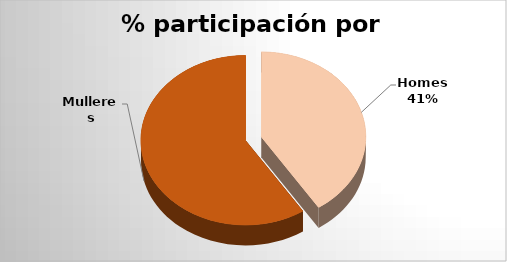
| Category | Series 0 |
|---|---|
| Homes | 55 |
| Mulleres | 80 |